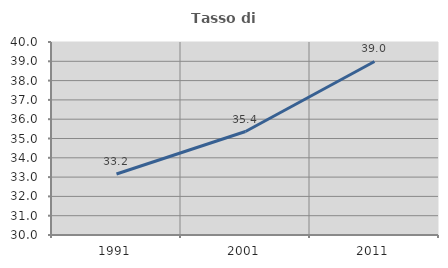
| Category | Tasso di occupazione   |
|---|---|
| 1991.0 | 33.159 |
| 2001.0 | 35.361 |
| 2011.0 | 38.992 |